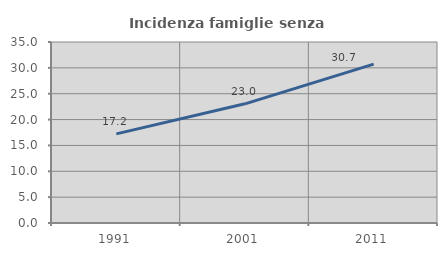
| Category | Incidenza famiglie senza nuclei |
|---|---|
| 1991.0 | 17.233 |
| 2001.0 | 23.045 |
| 2011.0 | 30.726 |